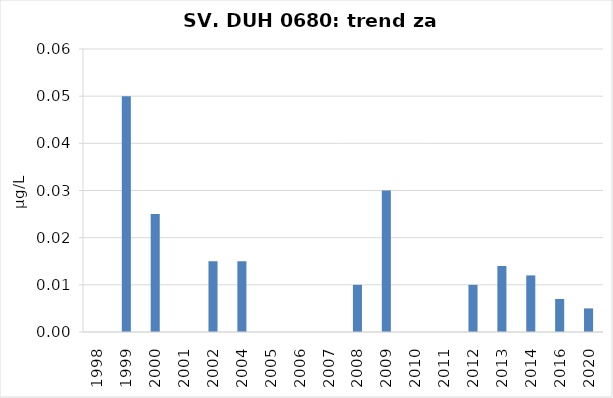
| Category | Vsota |
|---|---|
| 1998 | 0 |
| 1999 | 0.05 |
| 2000 | 0.025 |
| 2001 | 0 |
| 2002 | 0.015 |
| 2004 | 0.015 |
| 2005 | 0 |
| 2006 | 0 |
| 2007 | 0 |
| 2008 | 0.01 |
| 2009 | 0.03 |
| 2010 | 0 |
| 2011 | 0 |
| 2012 | 0.01 |
| 2013 | 0.014 |
| 2014 | 0.012 |
| 2016 | 0.007 |
| 2020 | 0.005 |